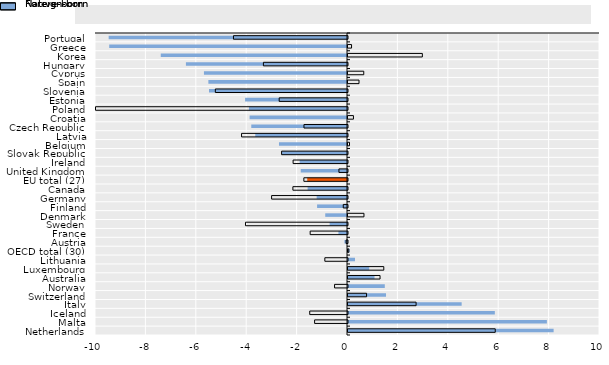
| Category | Foreign-born | Native-born |
|---|---|---|
| Portugal | -9.457 | -4.525 |
| Greece | -9.436 | 0.141 |
| Korea | -7.39 | 2.95 |
| Hungary | -6.392 | -3.338 |
| Cyprus | -5.677 | 0.626 |
| Spain | -5.501 | 0.437 |
| Slovenia | -5.476 | -5.245 |
| Estonia | -4.045 | -2.711 |
| Poland | -3.891 | -11.548 |
| Croatia | -3.865 | 0.216 |
| Czech Republic | -3.799 | -1.728 |
| Latvia | -3.641 | -4.204 |
| Belgium | -2.699 | 0.06 |
| Slovak Republic | -2.579 | -2.616 |
| Ireland | -1.878 | -2.159 |
| United Kingdom | -1.835 | -0.34 |
| EU total (27) | -1.578 | -1.732 |
| Canada | -1.563 | -2.167 |
| Germany | -1.204 | -3.012 |
| Finland | -1.188 | -0.168 |
| Denmark | -0.864 | 0.633 |
| Sweden | -0.689 | -4.048 |
| France | -0.34 | -1.482 |
| Austria | -0.102 | -0.055 |
| OECD total (30) | 0.065 | 0.032 |
| Lithuania | 0.277 | -0.9 |
| Luxembourg | 0.842 | 1.42 |
| Australia | 1.052 | 1.272 |
| Norway | 1.46 | -0.514 |
| Switzerland | 1.508 | 0.736 |
| Italy | 4.51 | 2.702 |
| Iceland | 5.827 | -1.499 |
| Malta | 7.892 | -1.305 |
| Netherlands | 8.16 | 5.843 |